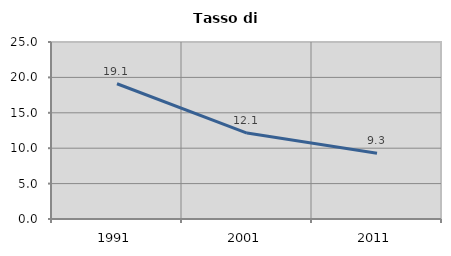
| Category | Tasso di disoccupazione   |
|---|---|
| 1991.0 | 19.105 |
| 2001.0 | 12.14 |
| 2011.0 | 9.289 |